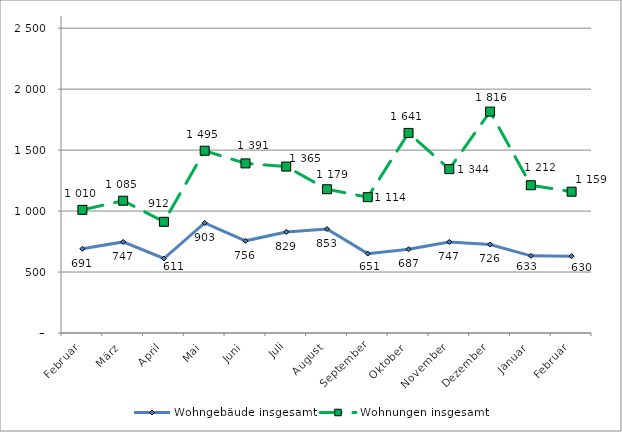
| Category | Wohngebäude insgesamt | Wohnungen insgesamt |
|---|---|---|
| Februar | 691 | 1010 |
| März | 747 | 1085 |
| April | 611 | 912 |
| Mai | 903 | 1495 |
| Juni | 756 | 1391 |
| Juli | 829 | 1365 |
| August | 853 | 1179 |
| September | 651 | 1114 |
| Oktober | 687 | 1641 |
| November | 747 | 1344 |
| Dezember | 726 | 1816 |
| Januar | 633 | 1212 |
| Februar | 630 | 1159 |